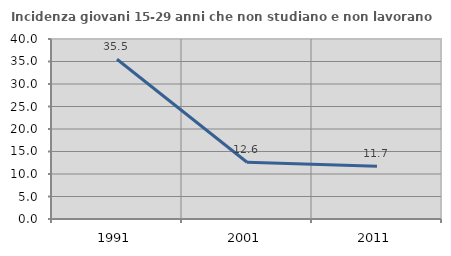
| Category | Incidenza giovani 15-29 anni che non studiano e non lavorano  |
|---|---|
| 1991.0 | 35.51 |
| 2001.0 | 12.621 |
| 2011.0 | 11.702 |